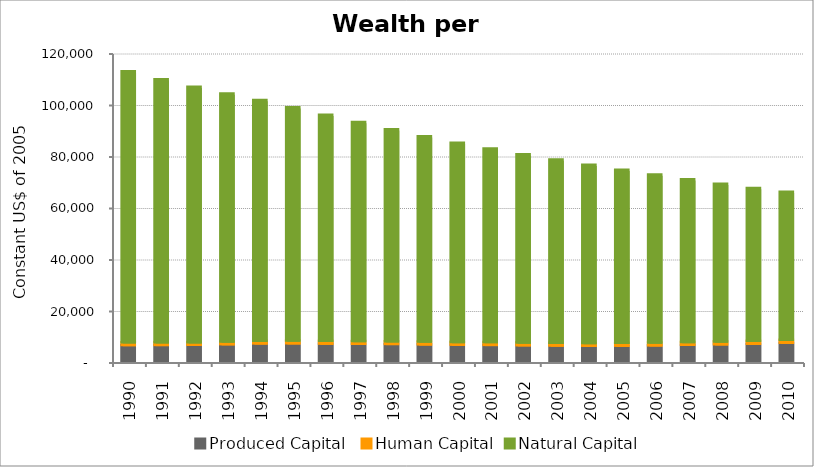
| Category | Produced Capital  | Human Capital | Natural Capital |
|---|---|---|---|
| 1990.0 | 6504.156 | 1052.467 | 105219.856 |
| 1991.0 | 6535.085 | 1060.913 | 102157.792 |
| 1992.0 | 6594.661 | 1023.274 | 99181.849 |
| 1993.0 | 6834.806 | 1032.213 | 96284.044 |
| 1994.0 | 7140.124 | 1041.129 | 93431.427 |
| 1995.0 | 7185.397 | 1049.456 | 90624.944 |
| 1996.0 | 7055.691 | 1053.005 | 87836.137 |
| 1997.0 | 6978.805 | 1056.4 | 85033.8 |
| 1998.0 | 6928.768 | 1059.526 | 82313.468 |
| 1999.0 | 6771.939 | 1062.742 | 79745.701 |
| 2000.0 | 6651.183 | 1065.812 | 77339.706 |
| 2001.0 | 6558.629 | 1068.487 | 75149.902 |
| 2002.0 | 6428.925 | 1071.868 | 73113.439 |
| 2003.0 | 6319.951 | 1075.852 | 71158.978 |
| 2004.0 | 6238.264 | 1080.055 | 69215.934 |
| 2005.0 | 6256.578 | 1084.297 | 67239.538 |
| 2006.0 | 6384.115 | 1089.832 | 65207.097 |
| 2007.0 | 6591.153 | 1095.826 | 63195.767 |
| 2008.0 | 6794.768 | 1102.185 | 61209.549 |
| 2009.0 | 7005.939 | 1108.845 | 59313.897 |
| 2010.0 | 7415.514 | 1115.711 | 57533.195 |